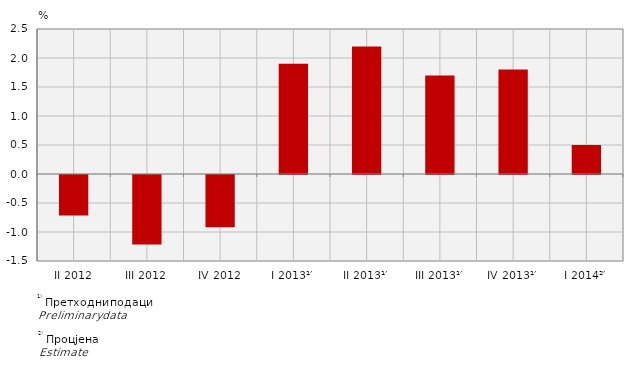
| Category | Стопе реалног раста БДП-а
Real growth rates of GDP |
|---|---|
| II 2012 | -0.7 |
| III 2012 | -1.2 |
| IV 2012 | -0.9 |
| I 2013¹′ | 1.9 |
| II 2013¹′ | 2.2 |
| III 2013¹′ | 1.7 |
| IV 2013¹′ | 1.8 |
| I 2014²′ | 0.5 |